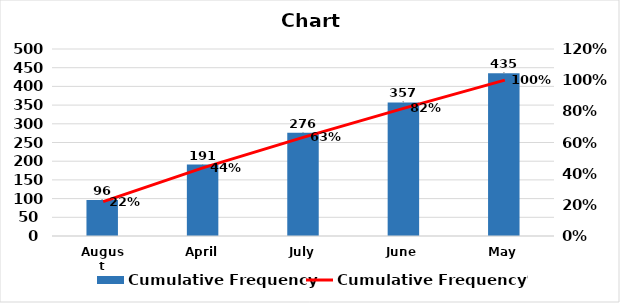
| Category | Cumulative Frequency |
|---|---|
| August | 96 |
| April | 191 |
| July | 276 |
| June | 357 |
| May | 435 |